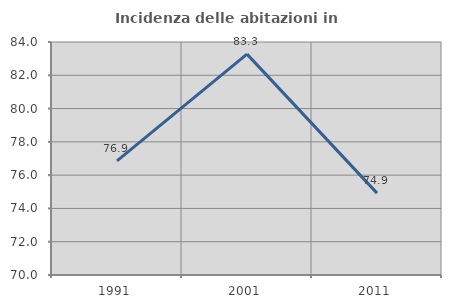
| Category | Incidenza delle abitazioni in proprietà  |
|---|---|
| 1991.0 | 76.855 |
| 2001.0 | 83.271 |
| 2011.0 | 74.92 |